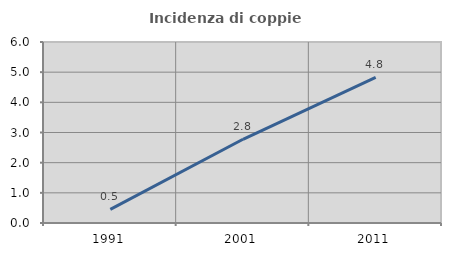
| Category | Incidenza di coppie miste |
|---|---|
| 1991.0 | 0.45 |
| 2001.0 | 2.775 |
| 2011.0 | 4.829 |